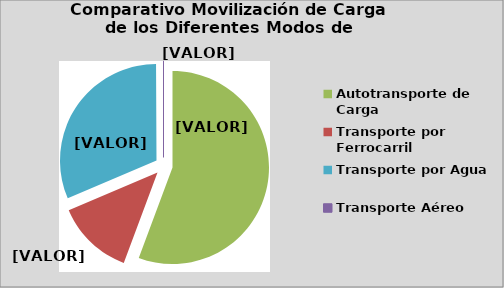
| Category | Series 0 |
|---|---|
| Autotransporte de Carga | 55.686 |
| Transporte por Ferrocarril | 12.896 |
| Transporte por Agua | 31.342 |
| Transporte Aéreo | 0.075 |